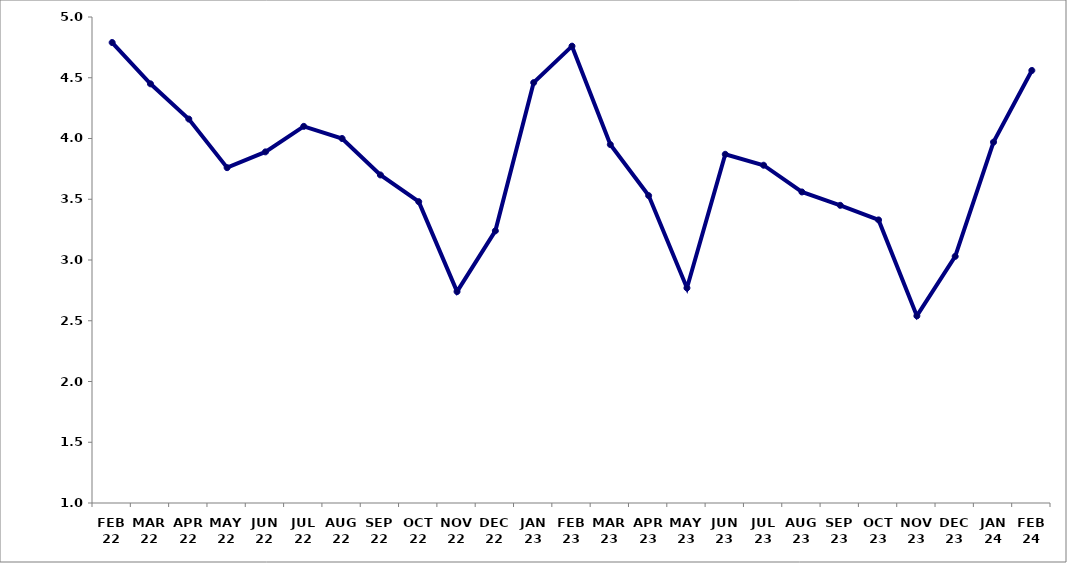
| Category | Series 0 |
|---|---|
| FEB 22 | 4.79 |
| MAR 22 | 4.45 |
| APR 22 | 4.16 |
| MAY 22 | 3.76 |
| JUN 22 | 3.89 |
| JUL 22 | 4.1 |
| AUG 22 | 4 |
| SEP 22 | 3.7 |
| OCT 22 | 3.48 |
| NOV 22 | 2.74 |
| DEC 22 | 3.24 |
| JAN 23 | 4.46 |
| FEB 23 | 4.76 |
| MAR 23 | 3.95 |
| APR 23 | 3.53 |
| MAY 23 | 2.77 |
| JUN 23 | 3.87 |
| JUL 23 | 3.78 |
| AUG 23 | 3.56 |
| SEP 23 | 3.45 |
| OCT 23 | 3.33 |
| NOV 23 | 2.54 |
| DEC 23 | 3.03 |
| JAN 24 | 3.97 |
| FEB 24 | 4.56 |